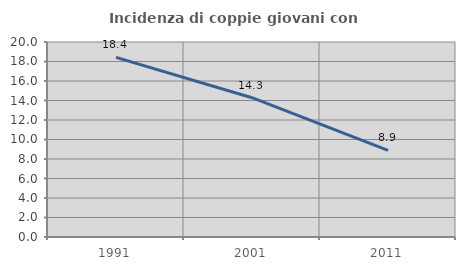
| Category | Incidenza di coppie giovani con figli |
|---|---|
| 1991.0 | 18.417 |
| 2001.0 | 14.286 |
| 2011.0 | 8.877 |